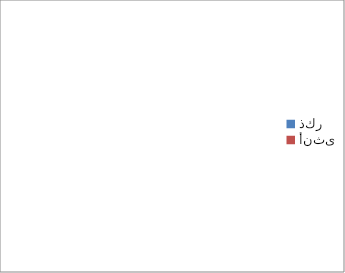
| Category | Series 0 |
|---|---|
| ذكر | 0 |
| أنثى | 0 |